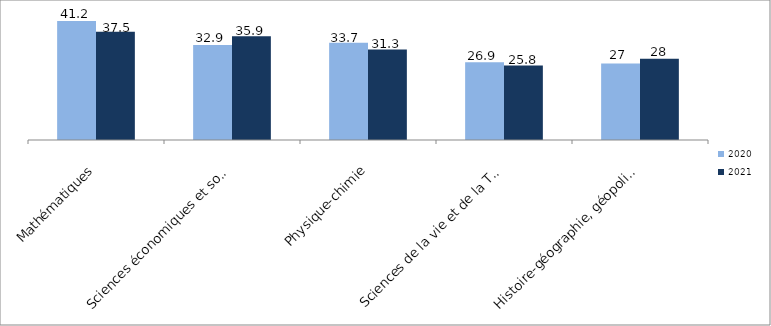
| Category | 2020 | 2021 |
|---|---|---|
| Mathématiques | 41.2 | 37.5 |
| Sciences économiques et sociales | 32.9 | 35.9 |
| Physique-chimie | 33.7 | 31.3 |
| Sciences de la vie et de la Terre | 26.9 | 25.8 |
| Histoire-géographie, géopolitique et sciences politiques | 26.5 | 28.1 |